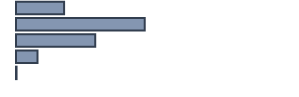
| Category | Series 0 |
|---|---|
| 0 | 17.3 |
| 1 | 46.3 |
| 2 | 28.5 |
| 3 | 7.7 |
| 4 | 0.2 |